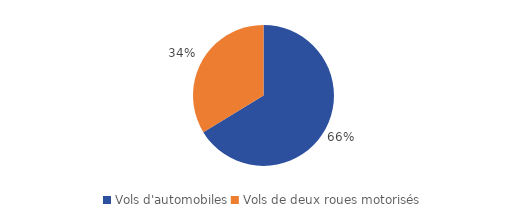
| Category | Series 0 |
|---|---|
| Vols d'automobiles | 79196 |
| Vols de deux roues motorisés | 40275 |